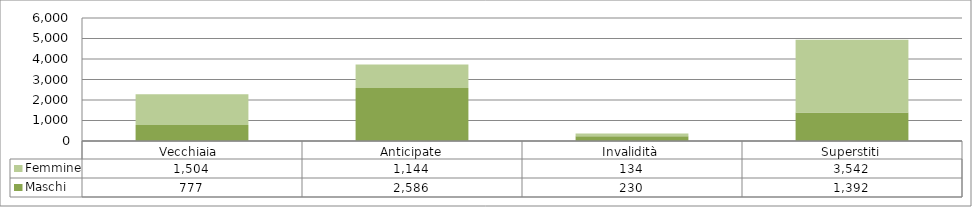
| Category | Maschi | Femmine |
|---|---|---|
| Vecchiaia  | 777 | 1504 |
| Anticipate | 2586 | 1144 |
| Invalidità | 230 | 134 |
| Superstiti | 1392 | 3542 |